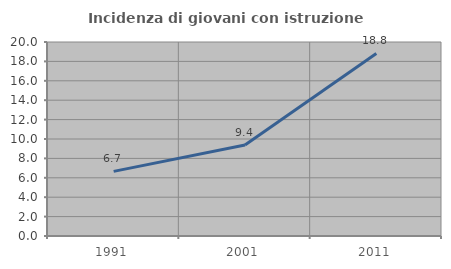
| Category | Incidenza di giovani con istruzione universitaria |
|---|---|
| 1991.0 | 6.66 |
| 2001.0 | 9.386 |
| 2011.0 | 18.819 |